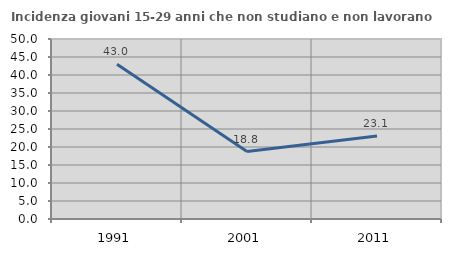
| Category | Incidenza giovani 15-29 anni che non studiano e non lavorano  |
|---|---|
| 1991.0 | 42.995 |
| 2001.0 | 18.75 |
| 2011.0 | 23.077 |